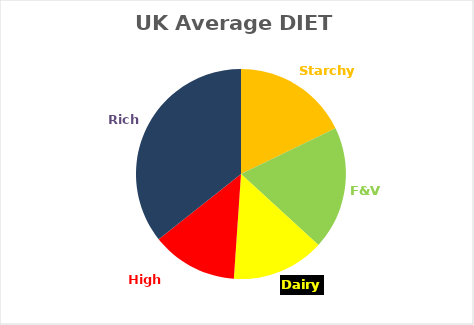
| Category | Series 0 |
|---|---|
| Starchy | 312 |
| F&V | 332 |
| Dairy | 250 |
| High Protein | 232 |
| Rich | 624 |